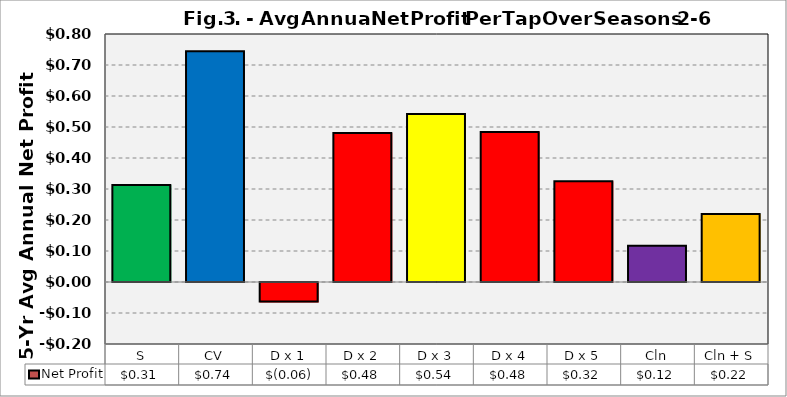
| Category | Net Profit |
|---|---|
| S | 0.313 |
| CV | 0.744 |
| D x 1 | -0.063 |
| D x 2 | 0.481 |
| D x 3 | 0.542 |
| D x 4 | 0.484 |
| D x 5 | 0.325 |
| Cln | 0.117 |
| Cln + S | 0.219 |